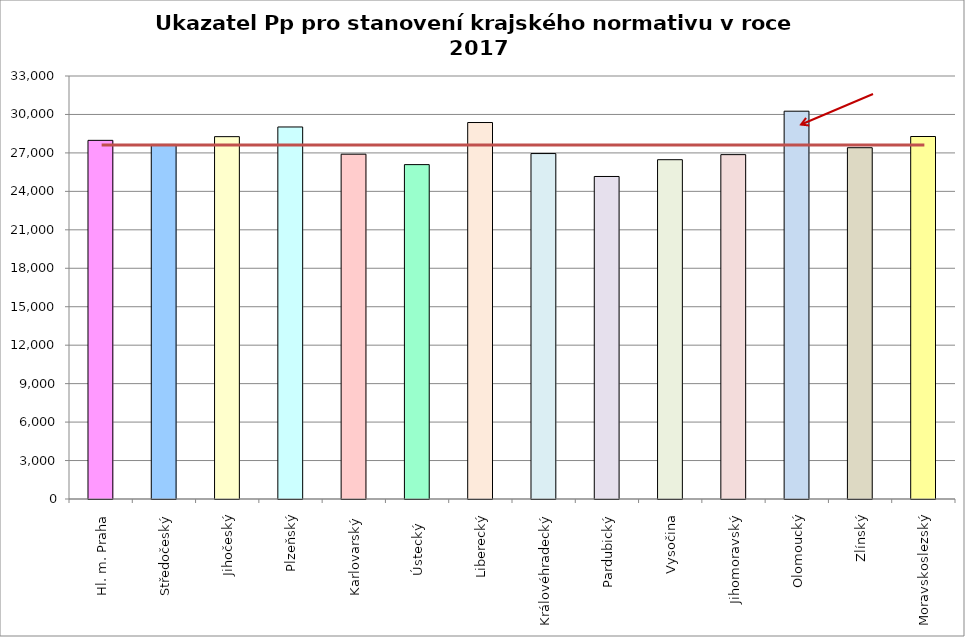
| Category | Series 0 |
|---|---|
| Hl. m. Praha | 27980 |
| Středočeský | 27660 |
| Jihočeský | 28269 |
| Plzeňský | 29023 |
| Karlovarský  | 26900 |
| Ústecký   | 26087 |
| Liberecký | 29370 |
| Královéhradecký | 26950 |
| Pardubický | 25161 |
| Vysočina | 26470 |
| Jihomoravský | 26865 |
| Olomoucký | 30254 |
| Zlínský | 27406 |
| Moravskoslezský | 28280 |